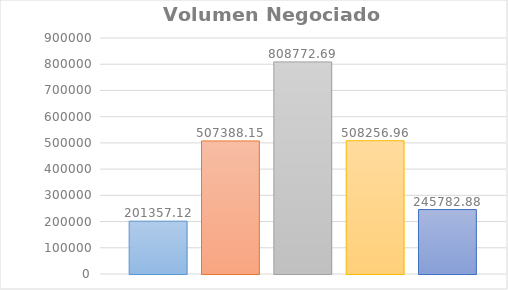
| Category | Lunes | Martes | Miercoles | Jueves | Viernes |
|---|---|---|---|---|---|
| 0 | 201357.12 | 507388.15 | 808772.69 | 508256.96 | 245782.88 |